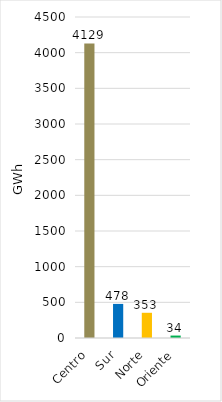
| Category | Series 0 |
|---|---|
| Centro | 4129.063 |
| Sur | 477.957 |
| Norte | 353.471 |
| Oriente | 34.188 |